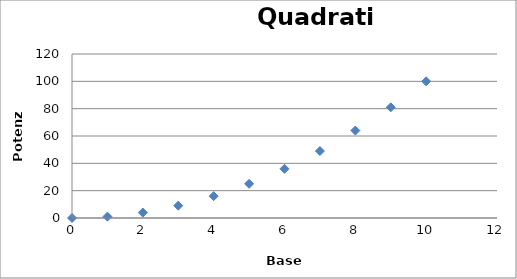
| Category | Potenza |
|---|---|
| 0.0 | 0 |
| 1.0 | 1 |
| 2.0 | 4 |
| 3.0 | 9 |
| 4.0 | 16 |
| 5.0 | 25 |
| 6.0 | 36 |
| 7.0 | 49 |
| 8.0 | 64 |
| 9.0 | 81 |
| 10.0 | 100 |